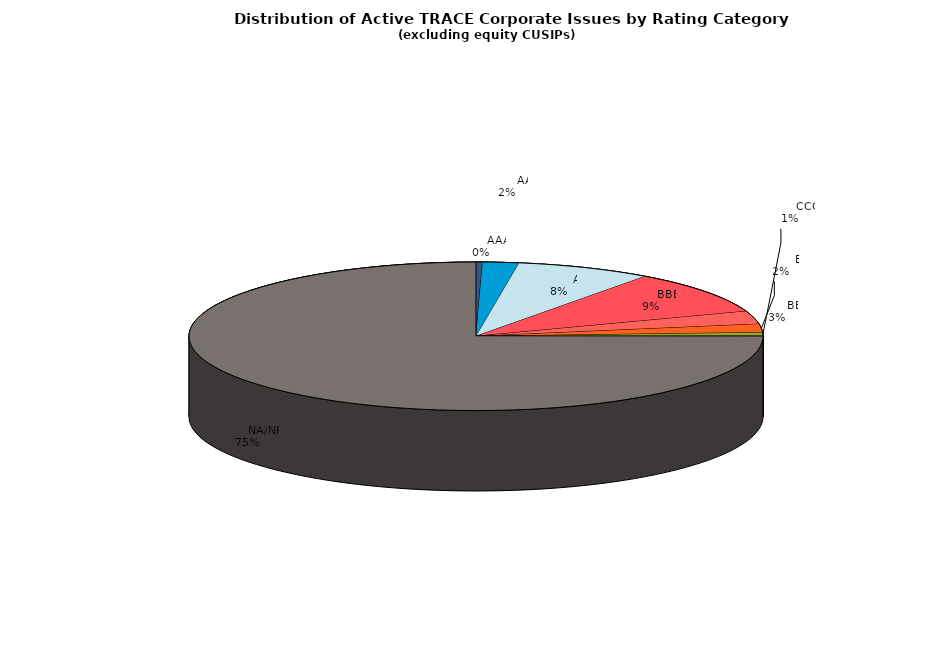
| Category | Series 0 |
|---|---|
|         AAA | 490 |
|         AA | 2727 |
|         A | 10206 |
|         BBB | 12674 |
|         BB | 3786 |
|         B | 2431 |
|         CCC | 1008 |
|         CC | 44 |
|         C | 42 |
|         D | 65 |
|         NA/NR | 100059 |